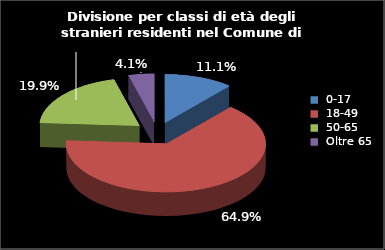
| Category | Series 0 |
|---|---|
| 0-17 | 143 |
| 18-49 | 833 |
| 50-65 | 255 |
| Oltre 65 | 53 |